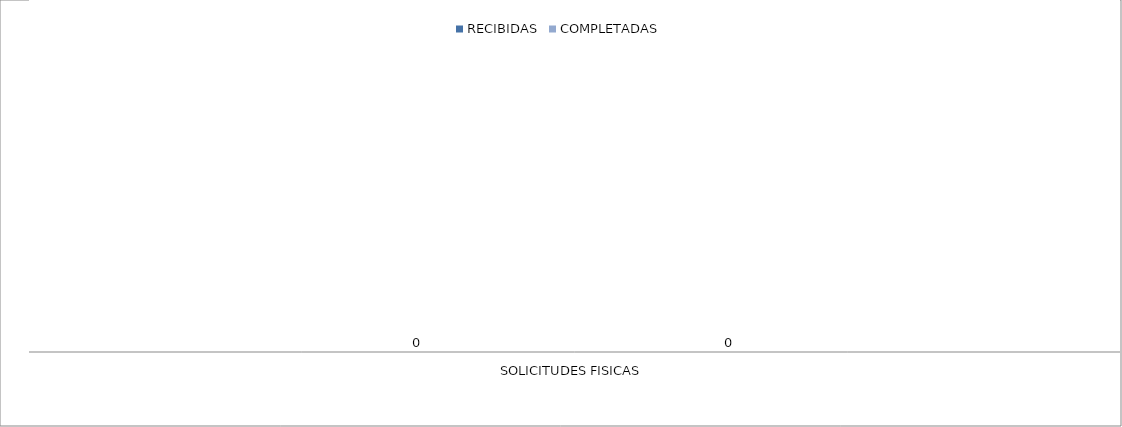
| Category | RECIBIDAS | COMPLETADAS |
|---|---|---|
| SOLICITUDES FISICAS | 0 | 0 |